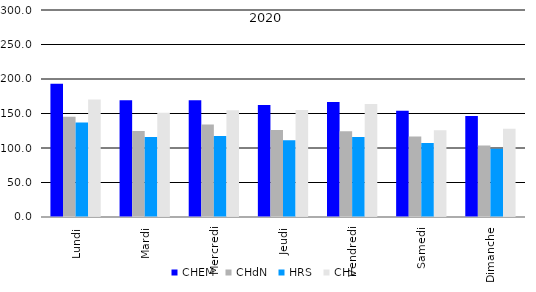
| Category | CHEM  | CHdN  | HRS  | CHL  |
|---|---|---|---|---|
| Lundi | 193.115 | 145.327 | 136.865 | 170.231 |
| Mardi | 169.231 | 124.788 | 116.077 | 151.25 |
| Mercredi | 169.245 | 133.962 | 117.358 | 154.642 |
| Jeudi | 162.302 | 126.113 | 111.396 | 154.943 |
| Vendredi | 166.519 | 124.442 | 116.038 | 163.596 |
| Samedi | 154.077 | 116.846 | 107.154 | 125.827 |
| Dimanche | 146.519 | 103.481 | 99.019 | 128.038 |